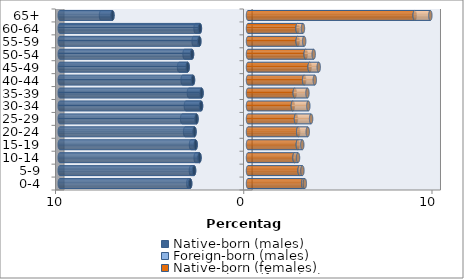
| Category | Native-born (males) | Foreign-born (males) | Native-born (females) | Foreign-born (females) |
|---|---|---|---|---|
| 0-4 | -3.071 | -0.098 | 2.935 | 0.085 |
| 5-9 | -2.865 | -0.167 | 2.742 | 0.148 |
| 10-14 | -2.578 | -0.203 | 2.472 | 0.185 |
| 15-19 | -2.782 | -0.245 | 2.648 | 0.235 |
| 20-24 | -2.842 | -0.499 | 2.666 | 0.508 |
| 25-29 | -2.736 | -0.762 | 2.549 | 0.803 |
| 30-34 | -2.494 | -0.805 | 2.384 | 0.821 |
| 35-39 | -2.468 | -0.672 | 2.484 | 0.673 |
| 40-44 | -2.922 | -0.551 | 2.981 | 0.566 |
| 45-49 | -3.207 | -0.456 | 3.274 | 0.483 |
| 50-54 | -2.973 | -0.397 | 3.065 | 0.425 |
| 55-59 | -2.586 | -0.303 | 2.64 | 0.344 |
| 60-64 | -2.555 | -0.231 | 2.632 | 0.287 |
| 65+ | -7.201 | -0.607 | 8.855 | 0.831 |